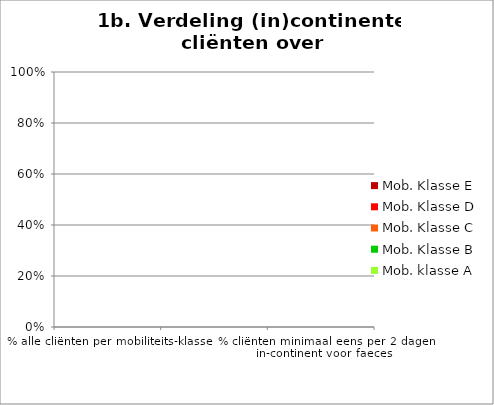
| Category | Mob. klasse A | Mob. Klasse B | Mob. Klasse C | Mob. Klasse D | Mob. Klasse E |
|---|---|---|---|---|---|
| % alle cliënten per mobiliteits-klasse | 0 | 0 | 0 | 0 | 0 |
| % cliënten (vrijwel) dagelijks in-continent voor urine | 0 | 0 | 0 | 0 | 0 |
| % cliënten minimaal eens per 2 dagen in-continent voor faeces | 0 | 0 | 0 | 0 | 0 |